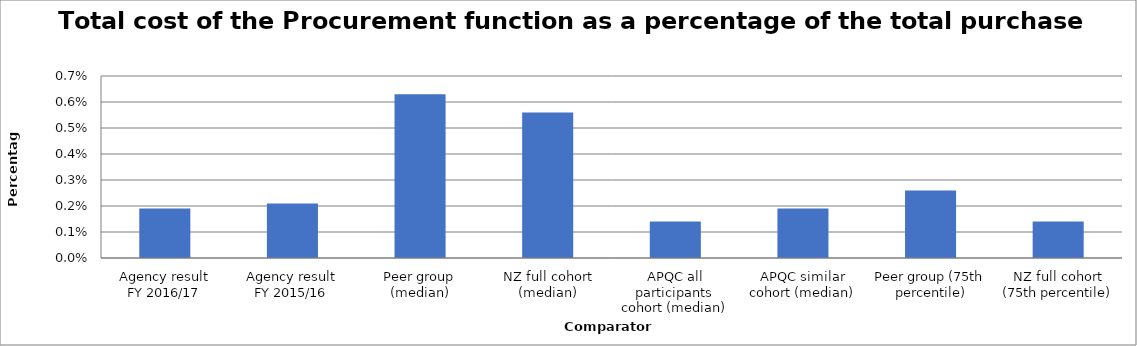
| Category | Result |
|---|---|
| Agency result
FY 2016/17 | 0.002 |
| Agency result
FY 2015/16 | 0.002 |
| Peer group (median) | 0.006 |
| NZ full cohort (median) | 0.006 |
| APQC all participants cohort (median) | 0.001 |
| APQC similar cohort (median) | 0.002 |
| Peer group (75th percentile) | 0.003 |
| NZ full cohort (75th percentile) | 0.001 |